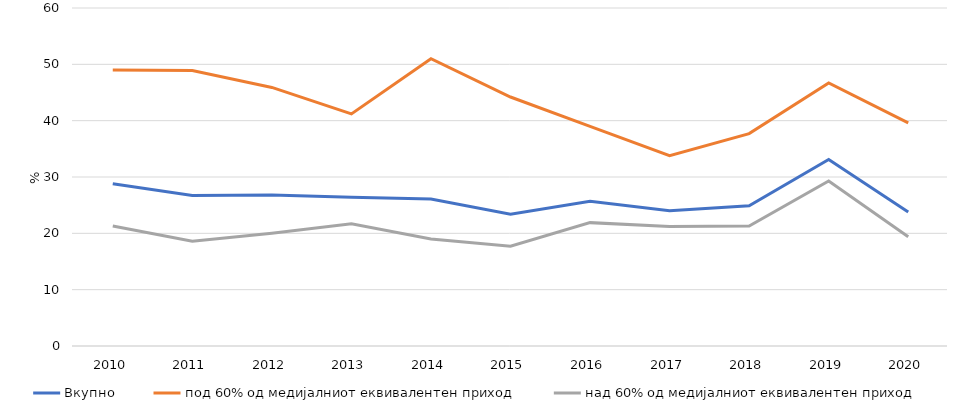
| Category | Вкупно  | под 60% од медијалниот еквивалентен приход | над 60% од медијалниот еквивалентен приход |
|---|---|---|---|
| 2010 | 28.8 | 49 | 21.3 |
| 2011 | 26.7 | 48.9 | 18.6 |
| 2012 | 26.8 | 45.9 | 20 |
| 2013 | 26.4 | 41.2 | 21.7 |
| 2014 | 26.1 | 51 | 19 |
| 2015 | 23.4 | 44.2 | 17.7 |
| 2016 | 25.7 | 39 | 21.9 |
| 2017 | 24 | 33.8 | 21.2 |
| 2018 | 24.9 | 37.7 | 21.3 |
| 2019 | 33.1 | 46.7 | 29.3 |
| 2020 | 23.8 | 39.6 | 19.4 |